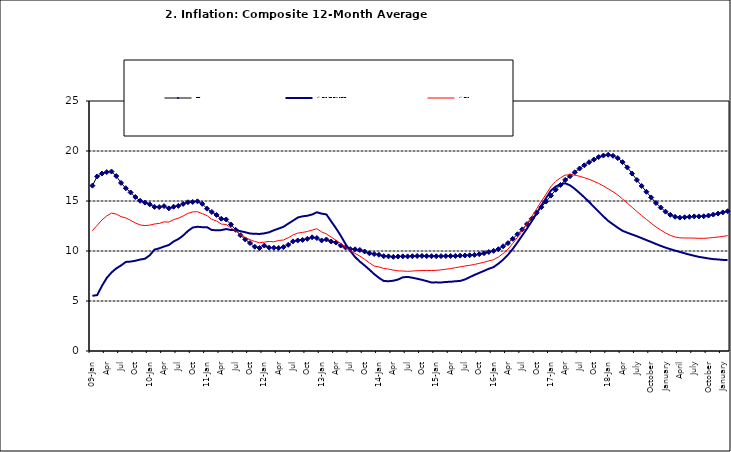
| Category | Food | All Items less Farm Produce | All Items |
|---|---|---|---|
| 09-Jan | 16.536 | 5.519 | 12.032 |
| Feb | 17.454 | 5.591 | 12.567 |
| Mar | 17.742 | 6.51 | 13.101 |
| Apr | 17.89 | 7.302 | 13.51 |
| May | 17.949 | 7.847 | 13.787 |
| June | 17.498 | 8.259 | 13.694 |
| Jul | 16.808 | 8.554 | 13.437 |
| Aug | 16.278 | 8.906 | 13.307 |
| Sep | 15.859 | 8.942 | 13.065 |
| Oct | 15.396 | 9.024 | 12.803 |
| Nov | 15.018 | 9.143 | 12.609 |
| Dec | 14.841 | 9.226 | 12.538 |
| 10-Jan | 14.668 | 9.567 | 12.586 |
| Feb | 14.411 | 10.138 | 12.7 |
| Mar | 14.395 | 10.269 | 12.757 |
| Apr | 14.489 | 10.444 | 12.915 |
| May | 14.266 | 10.597 | 12.893 |
| Jun | 14.424 | 10.948 | 13.132 |
| Jul | 14.514 | 11.193 | 13.284 |
| Aug | 14.706 | 11.549 | 13.5 |
| Sep | 14.872 | 11.997 | 13.764 |
| Oct | 14.906 | 12.345 | 13.908 |
| Nov | 14.967 | 12.423 | 13.928 |
| Dec | 14.723 | 12.383 | 13.74 |
| 11-Jan | 14.233 | 12.385 | 13.542 |
| Feb | 13.903 | 12.099 | 13.161 |
| Mar | 13.606 | 12.077 | 13.001 |
| Apr | 13.227 | 12.088 | 12.694 |
| May | 13.152 | 12.198 | 12.648 |
| Jun | 12.654 | 12.1 | 12.321 |
| Jul | 12.118 | 12.109 | 12.009 |
| Aug | 11.575 | 11.98 | 11.635 |
| Sep | 11.155 | 11.877 | 11.363 |
| Oct | 10.797 | 11.746 | 11.13 |
| Nov | 10.422 | 11.721 | 10.952 |
| Dec | 10.298 | 11.706 | 10.826 |
| 12-Jan | 10.538 | 11.765 | 10.886 |
| 12-Feb | 10.336 | 11.872 | 10.955 |
| 12-Mar | 10.325 | 12.075 | 10.914 |
| Apr | 10.304 | 12.242 | 11.054 |
| May | 10.387 | 12.419 | 11.096 |
| Jun | 10.617 | 12.732 | 11.32 |
| Jul | 10.963 | 13.032 | 11.599 |
| Aug | 11.056 | 13.349 | 11.791 |
| Sep | 11.104 | 13.467 | 11.859 |
| Oct | 11.216 | 13.525 | 11.948 |
| Nov | 11.372 | 13.649 | 12.091 |
| Dec | 11.296 | 13.873 | 12.224 |
| 13-Jan | 11.055 | 13.737 | 11.908 |
| Feb | 11.153 | 13.657 | 11.703 |
| Mar | 10.951 | 12.963 | 11.394 |
| Apr | 10.844 | 12.281 | 11.072 |
| May | 10.548 | 11.531 | 10.761 |
| Jun | 10.352 | 10.704 | 10.383 |
| Jul | 10.186 | 10.005 | 10.047 |
| Aug | 10.168 | 9.4 | 9.761 |
| Sep | 10.105 | 8.939 | 9.486 |
| Oct | 9.955 | 8.553 | 9.167 |
| Nov | 9.774 | 8.136 | 8.815 |
| Dec | 9.695 | 7.691 | 8.496 |
| 14-Jan | 9.626 | 7.317 | 8.408 |
| Feb | 9.484 | 7.005 | 8.257 |
| Mar | 9.464 | 6.976 | 8.19 |
| Apr | 9.416 | 7.03 | 8.092 |
| May | 9.448 | 7.151 | 8.012 |
| Jun | 9.464 | 7.369 | 7.998 |
| Jul | 9.459 | 7.411 | 7.968 |
| Aug | 9.481 | 7.325 | 7.996 |
| Sep | 9.501 | 7.228 | 8.027 |
| Oct | 9.508 | 7.116 | 8.047 |
| Nov | 9.492 | 6.991 | 8.046 |
| Dec | 9.481 | 6.854 | 8.047 |
| 15-Jan | 9.475 | 6.865 | 8.063 |
| Feb | 9.486 | 6.852 | 8.117 |
| Mar | 9.495 | 6.905 | 8.176 |
| Apr | 9.501 | 6.922 | 8.243 |
| May | 9.51 | 6.975 | 8.331 |
| Jun | 9.535 | 7.006 | 8.417 |
| Jul | 9.552 | 7.154 | 8.497 |
| Aug | 9.571 | 7.384 | 8.566 |
| Sep | 9.614 | 7.605 | 8.658 |
| Oct | 9.68 | 7.812 | 8.76 |
| Nov | 9.778 | 8.016 | 8.879 |
| Dec | 9.898 | 8.222 | 9.009 |
| 16-Jan | 10.017 | 8.391 | 9.13 |
| Feb | 10.184 | 8.732 | 9.386 |
| Mar | 10.471 | 9.132 | 9.751 |
| Apr | 10.786 | 9.614 | 10.182 |
| May | 11.221 | 10.196 | 10.746 |
| Jun | 11.672 | 10.864 | 11.372 |
| Jul | 12.162 | 11.553 | 12.045 |
| Aug | 12.696 | 12.247 | 12.744 |
| Sep | 13.238 | 12.98 | 13.454 |
| Oct | 13.817 | 13.757 | 14.206 |
| Nov | 14.386 | 14.542 | 14.958 |
| Dec | 14.946 | 15.307 | 15.697 |
| 17-Jan | 15.536 | 16.042 | 16.441 |
| Feb | 16.127 | 16.436 | 16.958 |
| Mar | 16.598 | 16.682 | 17.315 |
| Apr | 17.106 | 16.772 | 17.591 |
| May | 17.477 | 16.567 | 17.628 |
| Jun | 17.868 | 16.219 | 17.578 |
| Jul | 18.247 | 15.798 | 17.475 |
| Aug | 18.569 | 15.372 | 17.331 |
| Sep | 18.876 | 14.903 | 17.17 |
| Oct | 19.14 | 14.415 | 16.968 |
| Nov | 19.392 | 13.93 | 16.76 |
| Dec | 19.546 | 13.458 | 16.502 |
| 18-Jan | 19.621 | 13.01 | 16.215 |
| Feb | 19.521 | 12.668 | 15.93 |
| Mar | 19.294 | 12.33 | 15.599 |
| Apr | 18.886 | 12.021 | 15.196 |
| May | 18.359 | 11.828 | 14.793 |
| June | 17.745 | 11.651 | 14.371 |
| July | 17.102 | 11.478 | 13.95 |
| August | 16.501 | 11.285 | 13.546 |
| September | 15.923 | 11.092 | 13.157 |
| October | 15.355 | 10.903 | 12.777 |
| November | 14.802 | 10.703 | 12.406 |
| December | 14.348 | 10.514 | 12.095 |
| January | 13.934 | 10.339 | 11.801 |
| February | 13.62 | 10.185 | 11.564 |
| March | 13.42 | 10.044 | 11.401 |
| April | 13.339 | 9.909 | 11.314 |
| May | 13.371 | 9.77 | 11.299 |
| June | 13.418 | 9.64 | 11.297 |
| July | 13.46 | 9.524 | 11.291 |
| August | 13.458 | 9.411 | 11.271 |
| September | 13.474 | 9.337 | 11.268 |
| October | 13.544 | 9.253 | 11.298 |
| November | 13.646 | 9.189 | 11.348 |
| December | 13.743 | 9.155 | 11.396 |
| January | 13.859 | 9.112 | 11.462 |
| February | 13.98 | 9.086 | 11.539 |